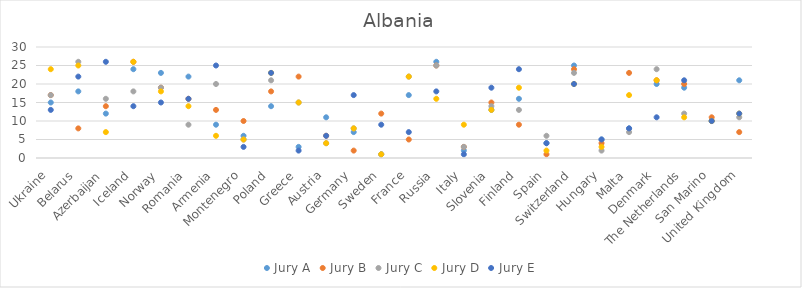
| Category | Jury A | Jury B | Jury C | Jury D | Jury E |
|---|---|---|---|---|---|
| Ukraine | 15 | 17 | 17 | 24 | 13 |
| Belarus | 18 | 8 | 26 | 25 | 22 |
| Azerbaijan | 12 | 14 | 16 | 7 | 26 |
| Iceland | 24 | 26 | 18 | 26 | 14 |
| Norway | 23 | 19 | 19 | 18 | 15 |
| Romania | 22 | 16 | 9 | 14 | 16 |
| Armenia | 9 | 13 | 20 | 6 | 25 |
| Montenegro | 6 | 10 | 5 | 5 | 3 |
| Poland | 14 | 18 | 21 | 23 | 23 |
| Greece | 3 | 22 | 15 | 15 | 2 |
| Austria | 11 | 6 | 4 | 4 | 6 |
| Germany | 7 | 2 | 8 | 8 | 17 |
| Sweden | 1 | 12 | 1 | 1 | 9 |
| France | 17 | 5 | 22 | 22 | 7 |
| Russia | 26 | 25 | 25 | 16 | 18 |
| Italy | 2 | 3 | 3 | 9 | 1 |
| Slovenia | 13 | 15 | 14 | 13 | 19 |
| Finland | 16 | 9 | 13 | 19 | 24 |
| Spain | 4 | 1 | 6 | 2 | 4 |
| Switzerland | 25 | 24 | 23 | 20 | 20 |
| Hungary | 5 | 4 | 2 | 3 | 5 |
| Malta | 8 | 23 | 7 | 17 | 8 |
| Denmark | 20 | 21 | 24 | 21 | 11 |
| The Netherlands | 19 | 20 | 12 | 11 | 21 |
| San Marino | 10 | 11 | 10 | 10 | 10 |
| United Kingdom | 21 | 7 | 11 | 12 | 12 |